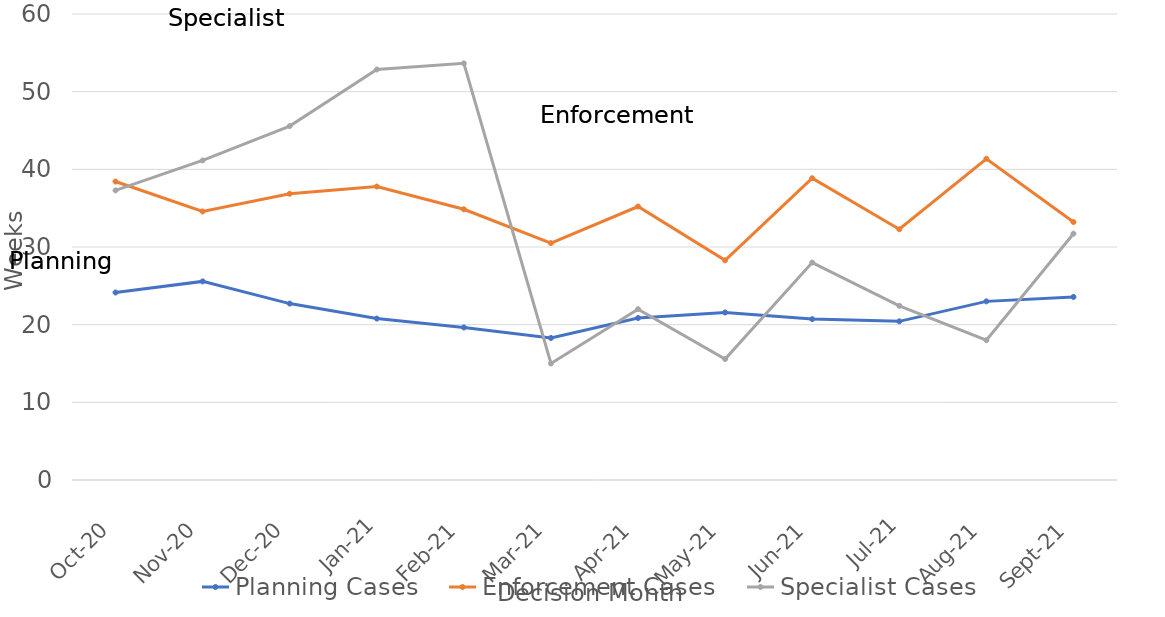
| Category | Planning Cases | Enforcement Cases | Specialist Cases |
|---|---|---|---|
| 2020-10-01 | 24.143 | 38.429 | 37.286 |
| 2020-11-01 | 25.571 | 34.571 | 41.143 |
| 2020-12-01 | 22.714 | 36.857 | 45.571 |
| 2021-01-01 | 20.786 | 37.786 | 52.857 |
| 2021-02-01 | 19.643 | 34.857 | 53.643 |
| 2021-03-01 | 18.286 | 30.5 | 15 |
| 2021-04-01 | 20.857 | 35.214 | 22 |
| 2021-05-01 | 21.571 | 28.286 | 15.571 |
| 2021-06-01 | 20.714 | 38.857 | 28 |
| 2021-07-01 | 20.429 | 32.286 | 22.429 |
| 2021-08-01 | 23 | 41.357 | 18 |
| 2021-09-01 | 23.571 | 33.214 | 31.714 |